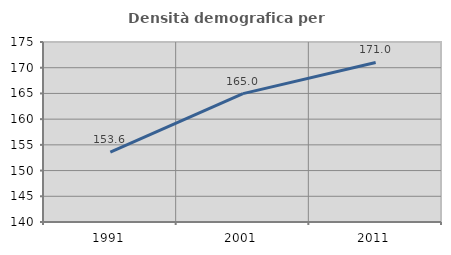
| Category | Densità demografica |
|---|---|
| 1991.0 | 153.572 |
| 2001.0 | 164.964 |
| 2011.0 | 171.021 |